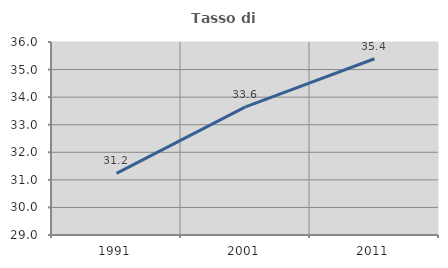
| Category | Tasso di occupazione   |
|---|---|
| 1991.0 | 31.236 |
| 2001.0 | 33.645 |
| 2011.0 | 35.393 |